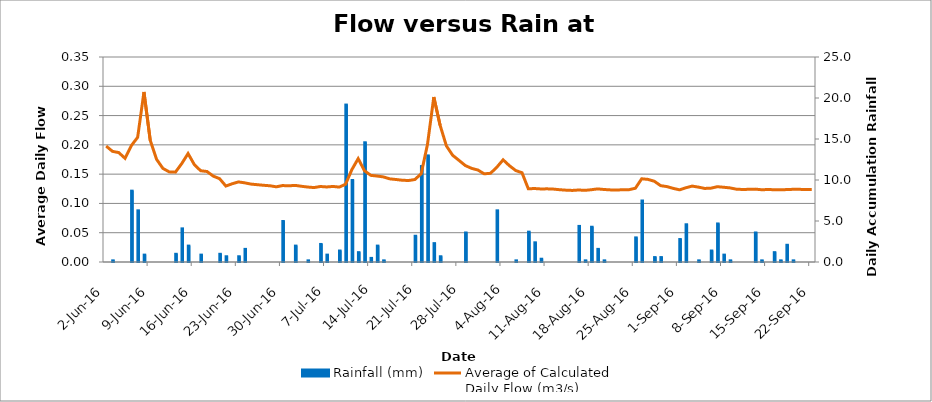
| Category | Rainfall (mm) |
|---|---|
| 2016-06-02 | 0 |
| 2016-06-03 | 0.2 |
| 2016-06-04 | 0 |
| 2016-06-05 | 0 |
| 2016-06-06 | 8.7 |
| 2016-06-07 | 6.3 |
| 2016-06-08 | 0.9 |
| 2016-06-09 | 0 |
| 2016-06-10 | 0 |
| 2016-06-11 | 0 |
| 2016-06-12 | 0 |
| 2016-06-13 | 1 |
| 2016-06-14 | 4.1 |
| 2016-06-15 | 2 |
| 2016-06-16 | 0 |
| 2016-06-17 | 0.9 |
| 2016-06-18 | 0 |
| 2016-06-19 | 0 |
| 2016-06-20 | 1 |
| 2016-06-21 | 0.7 |
| 2016-06-22 | 0 |
| 2016-06-23 | 0.7 |
| 2016-06-24 | 1.6 |
| 2016-06-25 | 0 |
| 2016-06-26 | 0 |
| 2016-06-27 | 0 |
| 2016-06-28 | 0 |
| 2016-06-29 | 0 |
| 2016-06-30 | 5 |
| 2016-07-01 | 0 |
| 2016-07-02 | 2 |
| 2016-07-03 | 0 |
| 2016-07-04 | 0.2 |
| 2016-07-05 | 0 |
| 2016-07-06 | 2.2 |
| 2016-07-07 | 0.9 |
| 2016-07-08 | 0 |
| 2016-07-09 | 1.4 |
| 2016-07-10 | 19.2 |
| 2016-07-11 | 10 |
| 2016-07-12 | 1.2 |
| 2016-07-13 | 14.6 |
| 2016-07-14 | 0.5 |
| 2016-07-15 | 2 |
| 2016-07-16 | 0.2 |
| 2016-07-17 | 0 |
| 2016-07-18 | 0 |
| 2016-07-19 | 0 |
| 2016-07-20 | 0 |
| 2016-07-21 | 3.2 |
| 2016-07-22 | 11.7 |
| 2016-07-23 | 13 |
| 2016-07-24 | 2.3 |
| 2016-07-25 | 0.7 |
| 2016-07-26 | 0 |
| 2016-07-27 | 0 |
| 2016-07-28 | 0 |
| 2016-07-29 | 3.6 |
| 2016-07-30 | 0 |
| 2016-07-31 | 0 |
| 2016-08-01 | 0 |
| 2016-08-02 | 0 |
| 2016-08-03 | 6.3 |
| 2016-08-04 | 0 |
| 2016-08-05 | 0 |
| 2016-08-06 | 0.2 |
| 2016-08-07 | 0 |
| 2016-08-08 | 3.7 |
| 2016-08-09 | 2.4 |
| 2016-08-10 | 0.4 |
| 2016-08-11 | 0 |
| 2016-08-12 | 0 |
| 2016-08-13 | 0 |
| 2016-08-14 | 0 |
| 2016-08-15 | 0 |
| 2016-08-16 | 4.4 |
| 2016-08-17 | 0.2 |
| 2016-08-18 | 4.3 |
| 2016-08-19 | 1.6 |
| 2016-08-20 | 0.2 |
| 2016-08-21 | 0 |
| 2016-08-22 | 0 |
| 2016-08-23 | 0 |
| 2016-08-24 | 0 |
| 2016-08-25 | 3 |
| 2016-08-26 | 7.5 |
| 2016-08-27 | 0 |
| 2016-08-28 | 0.6 |
| 2016-08-29 | 0.6 |
| 2016-08-30 | 0 |
| 2016-08-31 | 0 |
| 2016-09-01 | 2.8 |
| 2016-09-02 | 4.6 |
| 2016-09-03 | 0 |
| 2016-09-04 | 0.2 |
| 2016-09-05 | 0 |
| 2016-09-06 | 1.4 |
| 2016-09-07 | 4.7 |
| 2016-09-08 | 0.9 |
| 2016-09-09 | 0.2 |
| 2016-09-10 | 0 |
| 2016-09-11 | 0 |
| 2016-09-12 | 0 |
| 2016-09-13 | 3.6 |
| 2016-09-14 | 0.2 |
| 2016-09-15 | 0 |
| 2016-09-16 | 1.2 |
| 2016-09-17 | 0.2 |
| 2016-09-18 | 2.1 |
| 2016-09-19 | 0.2 |
| 2016-09-20 | 0 |
| 2016-09-21 | 0 |
| 2016-09-22 | 0 |